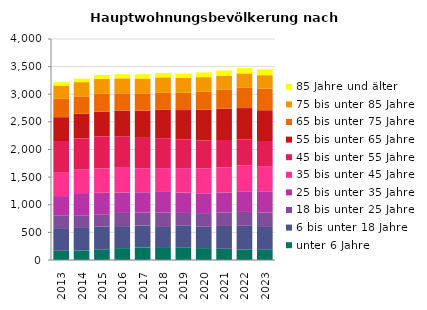
| Category | unter 6 Jahre | 6 bis unter 18 Jahre | 18 bis unter 25 Jahre | 25 bis unter 35 Jahre | 35 bis unter 45 Jahre | 45 bis unter 55 Jahre | 55 bis unter 65 Jahre | 65 bis unter 75 Jahre | 75 bis unter 85 Jahre | 85 Jahre und älter |
|---|---|---|---|---|---|---|---|---|---|---|
| 2013.0 | 167 | 410 | 224 | 356 | 422 | 575 | 431 | 332 | 242 | 59 |
| 2014.0 | 173 | 407 | 230 | 401 | 425 | 563 | 449 | 314 | 257 | 62 |
| 2015.0 | 185 | 419 | 224 | 389 | 440 | 581 | 449 | 320 | 272 | 71 |
| 2016.0 | 215 | 398 | 239 | 371 | 446 | 563 | 473 | 311 | 272 | 74 |
| 2017.0 | 227 | 398 | 233 | 368 | 434 | 551 | 491 | 314 | 269 | 77 |
| 2018.0 | 218 | 395 | 248 | 371 | 431 | 542 | 512 | 314 | 275 | 80 |
| 2019.0 | 221 | 398 | 233 | 368 | 443 | 518 | 533 | 314 | 269 | 77 |
| 2020.0 | 215 | 395 | 239 | 359 | 449 | 509 | 554 | 326 | 263 | 86 |
| 2021.0 | 203 | 413 | 245 | 362 | 452 | 497 | 566 | 344 | 254 | 95 |
| 2022.0 | 188 | 431 | 251 | 374 | 467 | 473 | 566 | 374 | 254 | 95 |
| 2023.0 | 185 | 413 | 260 | 386 | 455 | 455 | 557 | 392 | 242 | 107 |